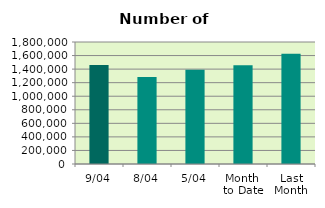
| Category | Series 0 |
|---|---|
| 9/04 | 1461416 |
| 8/04 | 1283012 |
| 5/04 | 1390066 |
| Month 
to Date | 1458275.429 |
| Last
Month | 1624932.286 |